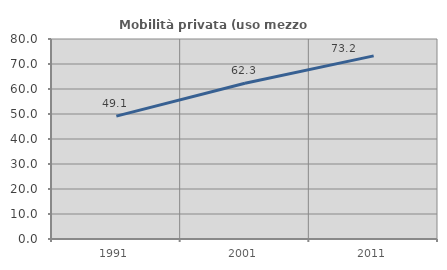
| Category | Mobilità privata (uso mezzo privato) |
|---|---|
| 1991.0 | 49.141 |
| 2001.0 | 62.273 |
| 2011.0 | 73.243 |